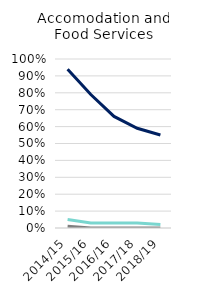
| Category | Employed | Self-Employed | Both |
|---|---|---|---|
| 2014/15 | 0.94 | 0.05 | 0.01 |
| 2015/16 | 0.79 | 0.03 | 0 |
| 2016/16 | 0.66 | 0.03 | 0 |
| 2017/18 | 0.59 | 0.03 | 0 |
| 2018/19 | 0.55 | 0.02 | 0 |